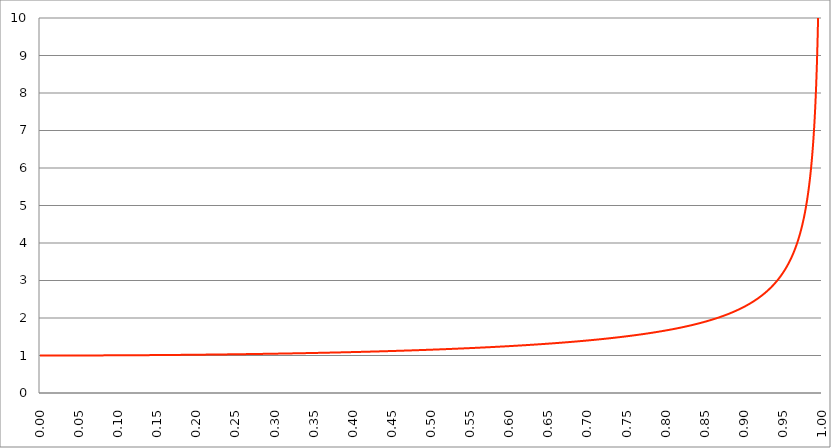
| Category | Series 1 |
|---|---|
| 0.0 | 1 |
| 0.0005 | 1 |
| 0.001 | 1 |
| 0.0015 | 1 |
| 0.002 | 1 |
| 0.0025 | 1 |
| 0.003 | 1 |
| 0.0035 | 1 |
| 0.004 | 1 |
| 0.0045 | 1 |
| 0.005 | 1 |
| 0.0055 | 1 |
| 0.006 | 1 |
| 0.0065 | 1 |
| 0.007 | 1 |
| 0.0075 | 1 |
| 0.008 | 1 |
| 0.0085 | 1 |
| 0.009 | 1 |
| 0.0095 | 1 |
| 0.01 | 1 |
| 0.0105 | 1 |
| 0.011 | 1 |
| 0.0115 | 1 |
| 0.012 | 1 |
| 0.0125 | 1 |
| 0.013 | 1 |
| 0.0135 | 1 |
| 0.014 | 1 |
| 0.0145 | 1 |
| 0.015 | 1 |
| 0.0155 | 1 |
| 0.016 | 1 |
| 0.0165 | 1 |
| 0.017 | 1 |
| 0.0175 | 1 |
| 0.018 | 1 |
| 0.0185 | 1 |
| 0.019 | 1 |
| 0.0195 | 1 |
| 0.02 | 1 |
| 0.0205 | 1 |
| 0.021 | 1 |
| 0.0215 | 1 |
| 0.022 | 1 |
| 0.0225 | 1 |
| 0.023 | 1 |
| 0.0235 | 1 |
| 0.024 | 1 |
| 0.0245 | 1 |
| 0.025 | 1 |
| 0.0255 | 1 |
| 0.026 | 1 |
| 0.0265 | 1 |
| 0.027 | 1 |
| 0.0275 | 1 |
| 0.028 | 1 |
| 0.0285 | 1 |
| 0.029 | 1 |
| 0.0295 | 1 |
| 0.03 | 1 |
| 0.0305 | 1 |
| 0.031 | 1 |
| 0.0315 | 1 |
| 0.032 | 1.001 |
| 0.0325 | 1.001 |
| 0.033 | 1.001 |
| 0.0335 | 1.001 |
| 0.034 | 1.001 |
| 0.0345 | 1.001 |
| 0.035 | 1.001 |
| 0.0355 | 1.001 |
| 0.036 | 1.001 |
| 0.0365 | 1.001 |
| 0.037 | 1.001 |
| 0.0375 | 1.001 |
| 0.038 | 1.001 |
| 0.0385 | 1.001 |
| 0.039 | 1.001 |
| 0.0395 | 1.001 |
| 0.04 | 1.001 |
| 0.0405 | 1.001 |
| 0.041 | 1.001 |
| 0.0415 | 1.001 |
| 0.042 | 1.001 |
| 0.0425 | 1.001 |
| 0.043 | 1.001 |
| 0.0435 | 1.001 |
| 0.044 | 1.001 |
| 0.0445 | 1.001 |
| 0.045 | 1.001 |
| 0.0455 | 1.001 |
| 0.046 | 1.001 |
| 0.0465 | 1.001 |
| 0.047 | 1.001 |
| 0.0475 | 1.001 |
| 0.048 | 1.001 |
| 0.0485 | 1.001 |
| 0.049 | 1.001 |
| 0.0495 | 1.001 |
| 0.05 | 1.001 |
| 0.0505 | 1.001 |
| 0.051 | 1.001 |
| 0.0515 | 1.001 |
| 0.052 | 1.001 |
| 0.0525 | 1.001 |
| 0.053 | 1.001 |
| 0.0535 | 1.001 |
| 0.054 | 1.001 |
| 0.0545 | 1.001 |
| 0.055 | 1.002 |
| 0.0555 | 1.002 |
| 0.056 | 1.002 |
| 0.0565 | 1.002 |
| 0.057 | 1.002 |
| 0.0575 | 1.002 |
| 0.058 | 1.002 |
| 0.0585 | 1.002 |
| 0.059 | 1.002 |
| 0.0595 | 1.002 |
| 0.06 | 1.002 |
| 0.0605 | 1.002 |
| 0.061 | 1.002 |
| 0.0615 | 1.002 |
| 0.062 | 1.002 |
| 0.0625 | 1.002 |
| 0.063 | 1.002 |
| 0.0635 | 1.002 |
| 0.064 | 1.002 |
| 0.0645 | 1.002 |
| 0.065 | 1.002 |
| 0.0655 | 1.002 |
| 0.066 | 1.002 |
| 0.0665 | 1.002 |
| 0.067 | 1.002 |
| 0.0675 | 1.002 |
| 0.068 | 1.002 |
| 0.0685 | 1.002 |
| 0.069 | 1.002 |
| 0.0695 | 1.002 |
| 0.07 | 1.002 |
| 0.0705 | 1.002 |
| 0.071 | 1.003 |
| 0.0715 | 1.003 |
| 0.072 | 1.003 |
| 0.0725 | 1.003 |
| 0.073 | 1.003 |
| 0.0735 | 1.003 |
| 0.074 | 1.003 |
| 0.0745 | 1.003 |
| 0.075 | 1.003 |
| 0.0755 | 1.003 |
| 0.076 | 1.003 |
| 0.0765 | 1.003 |
| 0.077 | 1.003 |
| 0.0775 | 1.003 |
| 0.078 | 1.003 |
| 0.0785 | 1.003 |
| 0.079 | 1.003 |
| 0.0795 | 1.003 |
| 0.08 | 1.003 |
| 0.0805 | 1.003 |
| 0.081 | 1.003 |
| 0.0815 | 1.003 |
| 0.082 | 1.003 |
| 0.0825 | 1.003 |
| 0.083 | 1.003 |
| 0.0835 | 1.004 |
| 0.084 | 1.004 |
| 0.0845 | 1.004 |
| 0.085 | 1.004 |
| 0.0855 | 1.004 |
| 0.086 | 1.004 |
| 0.0865 | 1.004 |
| 0.087 | 1.004 |
| 0.0875 | 1.004 |
| 0.088 | 1.004 |
| 0.0885 | 1.004 |
| 0.089 | 1.004 |
| 0.0895 | 1.004 |
| 0.09 | 1.004 |
| 0.0905 | 1.004 |
| 0.091 | 1.004 |
| 0.0915 | 1.004 |
| 0.092 | 1.004 |
| 0.0925 | 1.004 |
| 0.093 | 1.004 |
| 0.0935 | 1.004 |
| 0.094 | 1.004 |
| 0.0945 | 1.004 |
| 0.095 | 1.005 |
| 0.0955 | 1.005 |
| 0.096 | 1.005 |
| 0.0965 | 1.005 |
| 0.097 | 1.005 |
| 0.0975 | 1.005 |
| 0.098 | 1.005 |
| 0.0985 | 1.005 |
| 0.099 | 1.005 |
| 0.0995 | 1.005 |
| 0.1 | 1.005 |
| 0.1005 | 1.005 |
| 0.101 | 1.005 |
| 0.1015 | 1.005 |
| 0.102 | 1.005 |
| 0.1025 | 1.005 |
| 0.103 | 1.005 |
| 0.1035 | 1.005 |
| 0.104 | 1.005 |
| 0.1045 | 1.006 |
| 0.105 | 1.006 |
| 0.1055 | 1.006 |
| 0.106 | 1.006 |
| 0.1065 | 1.006 |
| 0.107 | 1.006 |
| 0.1075 | 1.006 |
| 0.108 | 1.006 |
| 0.1085 | 1.006 |
| 0.109 | 1.006 |
| 0.1095 | 1.006 |
| 0.11 | 1.006 |
| 0.1105 | 1.006 |
| 0.111 | 1.006 |
| 0.1115 | 1.006 |
| 0.112 | 1.006 |
| 0.1125 | 1.006 |
| 0.113 | 1.006 |
| 0.1135 | 1.007 |
| 0.114 | 1.007 |
| 0.1145 | 1.007 |
| 0.115 | 1.007 |
| 0.1155 | 1.007 |
| 0.116 | 1.007 |
| 0.1165 | 1.007 |
| 0.117 | 1.007 |
| 0.1175 | 1.007 |
| 0.118 | 1.007 |
| 0.1185 | 1.007 |
| 0.119 | 1.007 |
| 0.1195 | 1.007 |
| 0.12 | 1.007 |
| 0.1205 | 1.007 |
| 0.121 | 1.007 |
| 0.1215 | 1.007 |
| 0.122 | 1.008 |
| 0.1225 | 1.008 |
| 0.123 | 1.008 |
| 0.1235 | 1.008 |
| 0.124 | 1.008 |
| 0.1245 | 1.008 |
| 0.125 | 1.008 |
| 0.1255 | 1.008 |
| 0.126 | 1.008 |
| 0.1265 | 1.008 |
| 0.127 | 1.008 |
| 0.1275 | 1.008 |
| 0.128 | 1.008 |
| 0.1285 | 1.008 |
| 0.129 | 1.008 |
| 0.1295 | 1.008 |
| 0.13 | 1.009 |
| 0.1305 | 1.009 |
| 0.131 | 1.009 |
| 0.1315 | 1.009 |
| 0.132 | 1.009 |
| 0.1325 | 1.009 |
| 0.133 | 1.009 |
| 0.1335 | 1.009 |
| 0.134 | 1.009 |
| 0.1345 | 1.009 |
| 0.135 | 1.009 |
| 0.1355 | 1.009 |
| 0.136 | 1.009 |
| 0.1365 | 1.009 |
| 0.137 | 1.01 |
| 0.1375 | 1.01 |
| 0.138 | 1.01 |
| 0.1385 | 1.01 |
| 0.139 | 1.01 |
| 0.1395 | 1.01 |
| 0.14 | 1.01 |
| 0.1405 | 1.01 |
| 0.141 | 1.01 |
| 0.1415 | 1.01 |
| 0.142 | 1.01 |
| 0.1425 | 1.01 |
| 0.143 | 1.01 |
| 0.1435 | 1.01 |
| 0.144 | 1.011 |
| 0.1445 | 1.011 |
| 0.145 | 1.011 |
| 0.1455 | 1.011 |
| 0.146 | 1.011 |
| 0.1465 | 1.011 |
| 0.147 | 1.011 |
| 0.1475 | 1.011 |
| 0.148 | 1.011 |
| 0.1485 | 1.011 |
| 0.149 | 1.011 |
| 0.1495 | 1.011 |
| 0.15 | 1.011 |
| 0.1505 | 1.012 |
| 0.151 | 1.012 |
| 0.1515 | 1.012 |
| 0.152 | 1.012 |
| 0.1525 | 1.012 |
| 0.153 | 1.012 |
| 0.1535 | 1.012 |
| 0.154 | 1.012 |
| 0.1545 | 1.012 |
| 0.155 | 1.012 |
| 0.1555 | 1.012 |
| 0.156 | 1.012 |
| 0.1565 | 1.012 |
| 0.157 | 1.013 |
| 0.1575 | 1.013 |
| 0.158 | 1.013 |
| 0.1585 | 1.013 |
| 0.159 | 1.013 |
| 0.1595 | 1.013 |
| 0.16 | 1.013 |
| 0.1605 | 1.013 |
| 0.161 | 1.013 |
| 0.1615 | 1.013 |
| 0.162 | 1.013 |
| 0.1625 | 1.013 |
| 0.163 | 1.014 |
| 0.1635 | 1.014 |
| 0.164 | 1.014 |
| 0.1645 | 1.014 |
| 0.165 | 1.014 |
| 0.1655 | 1.014 |
| 0.166 | 1.014 |
| 0.1665 | 1.014 |
| 0.167 | 1.014 |
| 0.1675 | 1.014 |
| 0.168 | 1.014 |
| 0.1685 | 1.015 |
| 0.169 | 1.015 |
| 0.1695 | 1.015 |
| 0.17 | 1.015 |
| 0.1705 | 1.015 |
| 0.171 | 1.015 |
| 0.1715 | 1.015 |
| 0.172 | 1.015 |
| 0.1725 | 1.015 |
| 0.173 | 1.015 |
| 0.1735 | 1.015 |
| 0.174 | 1.015 |
| 0.1745 | 1.016 |
| 0.175 | 1.016 |
| 0.1755 | 1.016 |
| 0.176 | 1.016 |
| 0.1765 | 1.016 |
| 0.177 | 1.016 |
| 0.1775 | 1.016 |
| 0.178 | 1.016 |
| 0.1785 | 1.016 |
| 0.179 | 1.016 |
| 0.1795 | 1.017 |
| 0.18 | 1.017 |
| 0.1805 | 1.017 |
| 0.181 | 1.017 |
| 0.1815 | 1.017 |
| 0.182 | 1.017 |
| 0.1825 | 1.017 |
| 0.183 | 1.017 |
| 0.1835 | 1.017 |
| 0.184 | 1.017 |
| 0.1845 | 1.017 |
| 0.185 | 1.018 |
| 0.1855 | 1.018 |
| 0.186 | 1.018 |
| 0.1865 | 1.018 |
| 0.187 | 1.018 |
| 0.1875 | 1.018 |
| 0.188 | 1.018 |
| 0.1885 | 1.018 |
| 0.189 | 1.018 |
| 0.1895 | 1.018 |
| 0.19 | 1.019 |
| 0.1905 | 1.019 |
| 0.191 | 1.019 |
| 0.1915 | 1.019 |
| 0.192 | 1.019 |
| 0.1925 | 1.019 |
| 0.193 | 1.019 |
| 0.1935 | 1.019 |
| 0.194 | 1.019 |
| 0.1945 | 1.019 |
| 0.195 | 1.02 |
| 0.1955 | 1.02 |
| 0.196 | 1.02 |
| 0.1965 | 1.02 |
| 0.197 | 1.02 |
| 0.1975 | 1.02 |
| 0.198 | 1.02 |
| 0.1985 | 1.02 |
| 0.199 | 1.02 |
| 0.1995 | 1.021 |
| 0.2 | 1.021 |
| 0.2005 | 1.021 |
| 0.201 | 1.021 |
| 0.2015 | 1.021 |
| 0.202 | 1.021 |
| 0.2025 | 1.021 |
| 0.203 | 1.021 |
| 0.2035 | 1.021 |
| 0.204 | 1.021 |
| 0.2045 | 1.022 |
| 0.205 | 1.022 |
| 0.2055 | 1.022 |
| 0.206 | 1.022 |
| 0.2065 | 1.022 |
| 0.207 | 1.022 |
| 0.2075 | 1.022 |
| 0.208 | 1.022 |
| 0.2085 | 1.022 |
| 0.209 | 1.023 |
| 0.2095 | 1.023 |
| 0.21 | 1.023 |
| 0.2105 | 1.023 |
| 0.211 | 1.023 |
| 0.2115 | 1.023 |
| 0.212 | 1.023 |
| 0.2125 | 1.023 |
| 0.213 | 1.023 |
| 0.2135 | 1.024 |
| 0.214 | 1.024 |
| 0.2145 | 1.024 |
| 0.215 | 1.024 |
| 0.2155 | 1.024 |
| 0.216 | 1.024 |
| 0.2165 | 1.024 |
| 0.217 | 1.024 |
| 0.2175 | 1.025 |
| 0.218 | 1.025 |
| 0.2185 | 1.025 |
| 0.219 | 1.025 |
| 0.2195 | 1.025 |
| 0.22 | 1.025 |
| 0.2205 | 1.025 |
| 0.221 | 1.025 |
| 0.2215 | 1.025 |
| 0.222 | 1.026 |
| 0.2225 | 1.026 |
| 0.223 | 1.026 |
| 0.2235 | 1.026 |
| 0.224 | 1.026 |
| 0.2245 | 1.026 |
| 0.225 | 1.026 |
| 0.2255 | 1.026 |
| 0.226 | 1.027 |
| 0.2265 | 1.027 |
| 0.227 | 1.027 |
| 0.2275 | 1.027 |
| 0.228 | 1.027 |
| 0.2285 | 1.027 |
| 0.229 | 1.027 |
| 0.2295 | 1.027 |
| 0.23 | 1.028 |
| 0.2305 | 1.028 |
| 0.231 | 1.028 |
| 0.2315 | 1.028 |
| 0.232 | 1.028 |
| 0.2325 | 1.028 |
| 0.233 | 1.028 |
| 0.2335 | 1.028 |
| 0.234 | 1.029 |
| 0.2345 | 1.029 |
| 0.235 | 1.029 |
| 0.2355 | 1.029 |
| 0.236 | 1.029 |
| 0.2365 | 1.029 |
| 0.237 | 1.029 |
| 0.2375 | 1.029 |
| 0.238 | 1.03 |
| 0.2385 | 1.03 |
| 0.239 | 1.03 |
| 0.2395 | 1.03 |
| 0.24 | 1.03 |
| 0.2405 | 1.03 |
| 0.241 | 1.03 |
| 0.2415 | 1.031 |
| 0.242 | 1.031 |
| 0.2425 | 1.031 |
| 0.243 | 1.031 |
| 0.2435 | 1.031 |
| 0.244 | 1.031 |
| 0.2445 | 1.031 |
| 0.245 | 1.031 |
| 0.2455 | 1.032 |
| 0.246 | 1.032 |
| 0.2465 | 1.032 |
| 0.247 | 1.032 |
| 0.2475 | 1.032 |
| 0.248 | 1.032 |
| 0.2485 | 1.032 |
| 0.249 | 1.033 |
| 0.2495 | 1.033 |
| 0.25 | 1.033 |
| 0.2505 | 1.033 |
| 0.251 | 1.033 |
| 0.2515 | 1.033 |
| 0.252 | 1.033 |
| 0.2525 | 1.033 |
| 0.253 | 1.034 |
| 0.2535 | 1.034 |
| 0.254 | 1.034 |
| 0.2545 | 1.034 |
| 0.255 | 1.034 |
| 0.2555 | 1.034 |
| 0.256 | 1.034 |
| 0.2565 | 1.035 |
| 0.257 | 1.035 |
| 0.2575 | 1.035 |
| 0.258 | 1.035 |
| 0.2585 | 1.035 |
| 0.259 | 1.035 |
| 0.2595 | 1.035 |
| 0.26 | 1.036 |
| 0.2605 | 1.036 |
| 0.261 | 1.036 |
| 0.2615 | 1.036 |
| 0.262 | 1.036 |
| 0.2625 | 1.036 |
| 0.263 | 1.036 |
| 0.2635 | 1.037 |
| 0.264 | 1.037 |
| 0.2645 | 1.037 |
| 0.265 | 1.037 |
| 0.2655 | 1.037 |
| 0.266 | 1.037 |
| 0.2665 | 1.038 |
| 0.267 | 1.038 |
| 0.2675 | 1.038 |
| 0.268 | 1.038 |
| 0.2685 | 1.038 |
| 0.269 | 1.038 |
| 0.2695 | 1.038 |
| 0.27 | 1.039 |
| 0.2705 | 1.039 |
| 0.271 | 1.039 |
| 0.2715 | 1.039 |
| 0.272 | 1.039 |
| 0.2725 | 1.039 |
| 0.273 | 1.039 |
| 0.2735 | 1.04 |
| 0.274 | 1.04 |
| 0.2745 | 1.04 |
| 0.275 | 1.04 |
| 0.2755 | 1.04 |
| 0.276 | 1.04 |
| 0.2765 | 1.041 |
| 0.277 | 1.041 |
| 0.2775 | 1.041 |
| 0.278 | 1.041 |
| 0.2785 | 1.041 |
| 0.279 | 1.041 |
| 0.2795 | 1.042 |
| 0.28 | 1.042 |
| 0.2805 | 1.042 |
| 0.281 | 1.042 |
| 0.2815 | 1.042 |
| 0.282 | 1.042 |
| 0.2825 | 1.042 |
| 0.283 | 1.043 |
| 0.2835 | 1.043 |
| 0.284 | 1.043 |
| 0.2845 | 1.043 |
| 0.285 | 1.043 |
| 0.2855 | 1.043 |
| 0.286 | 1.044 |
| 0.2865 | 1.044 |
| 0.287 | 1.044 |
| 0.2875 | 1.044 |
| 0.288 | 1.044 |
| 0.2885 | 1.044 |
| 0.289 | 1.045 |
| 0.2895 | 1.045 |
| 0.29 | 1.045 |
| 0.2905 | 1.045 |
| 0.291 | 1.045 |
| 0.2915 | 1.045 |
| 0.292 | 1.046 |
| 0.2925 | 1.046 |
| 0.293 | 1.046 |
| 0.2935 | 1.046 |
| 0.294 | 1.046 |
| 0.2945 | 1.046 |
| 0.295 | 1.047 |
| 0.2955 | 1.047 |
| 0.296 | 1.047 |
| 0.2965 | 1.047 |
| 0.297 | 1.047 |
| 0.2975 | 1.047 |
| 0.298 | 1.048 |
| 0.2985 | 1.048 |
| 0.299 | 1.048 |
| 0.2995 | 1.048 |
| 0.3 | 1.048 |
| 0.3005 | 1.048 |
| 0.301 | 1.049 |
| 0.3015 | 1.049 |
| 0.302 | 1.049 |
| 0.3025 | 1.049 |
| 0.303 | 1.049 |
| 0.3035 | 1.05 |
| 0.304 | 1.05 |
| 0.3045 | 1.05 |
| 0.305 | 1.05 |
| 0.3055 | 1.05 |
| 0.306 | 1.05 |
| 0.3065 | 1.051 |
| 0.307 | 1.051 |
| 0.3075 | 1.051 |
| 0.308 | 1.051 |
| 0.3085 | 1.051 |
| 0.309 | 1.051 |
| 0.3095 | 1.052 |
| 0.31 | 1.052 |
| 0.3105 | 1.052 |
| 0.311 | 1.052 |
| 0.3115 | 1.052 |
| 0.312 | 1.053 |
| 0.3125 | 1.053 |
| 0.313 | 1.053 |
| 0.3135 | 1.053 |
| 0.314 | 1.053 |
| 0.3145 | 1.053 |
| 0.315 | 1.054 |
| 0.3155 | 1.054 |
| 0.316 | 1.054 |
| 0.3165 | 1.054 |
| 0.317 | 1.054 |
| 0.3175 | 1.055 |
| 0.318 | 1.055 |
| 0.3185 | 1.055 |
| 0.319 | 1.055 |
| 0.3195 | 1.055 |
| 0.32 | 1.056 |
| 0.3205 | 1.056 |
| 0.321 | 1.056 |
| 0.3215 | 1.056 |
| 0.322 | 1.056 |
| 0.3225 | 1.056 |
| 0.323 | 1.057 |
| 0.3235 | 1.057 |
| 0.324 | 1.057 |
| 0.3245 | 1.057 |
| 0.325 | 1.057 |
| 0.3255 | 1.058 |
| 0.326 | 1.058 |
| 0.3265 | 1.058 |
| 0.327 | 1.058 |
| 0.3275 | 1.058 |
| 0.328 | 1.059 |
| 0.3285 | 1.059 |
| 0.329 | 1.059 |
| 0.3295 | 1.059 |
| 0.33 | 1.059 |
| 0.3305 | 1.06 |
| 0.331 | 1.06 |
| 0.3315 | 1.06 |
| 0.332 | 1.06 |
| 0.3325 | 1.06 |
| 0.333 | 1.061 |
| 0.3335 | 1.061 |
| 0.334 | 1.061 |
| 0.3345 | 1.061 |
| 0.335 | 1.061 |
| 0.3355 | 1.062 |
| 0.336 | 1.062 |
| 0.3365 | 1.062 |
| 0.337 | 1.062 |
| 0.3375 | 1.062 |
| 0.338 | 1.063 |
| 0.3385 | 1.063 |
| 0.339 | 1.063 |
| 0.3395 | 1.063 |
| 0.34 | 1.063 |
| 0.3405 | 1.064 |
| 0.341 | 1.064 |
| 0.3415 | 1.064 |
| 0.342 | 1.064 |
| 0.3425 | 1.064 |
| 0.343 | 1.065 |
| 0.3435 | 1.065 |
| 0.344 | 1.065 |
| 0.3445 | 1.065 |
| 0.345 | 1.065 |
| 0.3455 | 1.066 |
| 0.346 | 1.066 |
| 0.3465 | 1.066 |
| 0.347 | 1.066 |
| 0.3475 | 1.066 |
| 0.348 | 1.067 |
| 0.3485 | 1.067 |
| 0.349 | 1.067 |
| 0.3495 | 1.067 |
| 0.35 | 1.068 |
| 0.3505 | 1.068 |
| 0.351 | 1.068 |
| 0.3515 | 1.068 |
| 0.352 | 1.068 |
| 0.3525 | 1.069 |
| 0.353 | 1.069 |
| 0.3535 | 1.069 |
| 0.354 | 1.069 |
| 0.3545 | 1.069 |
| 0.355 | 1.07 |
| 0.3555 | 1.07 |
| 0.356 | 1.07 |
| 0.3565 | 1.07 |
| 0.357 | 1.071 |
| 0.3575 | 1.071 |
| 0.358 | 1.071 |
| 0.3585 | 1.071 |
| 0.359 | 1.071 |
| 0.3595 | 1.072 |
| 0.36 | 1.072 |
| 0.3605 | 1.072 |
| 0.361 | 1.072 |
| 0.3615 | 1.073 |
| 0.362 | 1.073 |
| 0.3625 | 1.073 |
| 0.363 | 1.073 |
| 0.3635 | 1.073 |
| 0.364 | 1.074 |
| 0.3645 | 1.074 |
| 0.365 | 1.074 |
| 0.3655 | 1.074 |
| 0.366 | 1.075 |
| 0.3665 | 1.075 |
| 0.367 | 1.075 |
| 0.3675 | 1.075 |
| 0.368 | 1.075 |
| 0.3685 | 1.076 |
| 0.369 | 1.076 |
| 0.3695 | 1.076 |
| 0.37 | 1.076 |
| 0.3705 | 1.077 |
| 0.371 | 1.077 |
| 0.3715 | 1.077 |
| 0.372 | 1.077 |
| 0.3725 | 1.078 |
| 0.373 | 1.078 |
| 0.3735 | 1.078 |
| 0.374 | 1.078 |
| 0.3745 | 1.078 |
| 0.375 | 1.079 |
| 0.3755 | 1.079 |
| 0.376 | 1.079 |
| 0.3765 | 1.079 |
| 0.377 | 1.08 |
| 0.3775 | 1.08 |
| 0.378 | 1.08 |
| 0.3785 | 1.08 |
| 0.379 | 1.081 |
| 0.3795 | 1.081 |
| 0.38 | 1.081 |
| 0.3805 | 1.081 |
| 0.381 | 1.082 |
| 0.3815 | 1.082 |
| 0.382 | 1.082 |
| 0.3825 | 1.082 |
| 0.383 | 1.083 |
| 0.3835 | 1.083 |
| 0.384 | 1.083 |
| 0.3845 | 1.083 |
| 0.385 | 1.084 |
| 0.3855 | 1.084 |
| 0.386 | 1.084 |
| 0.3865 | 1.084 |
| 0.387 | 1.085 |
| 0.3875 | 1.085 |
| 0.388 | 1.085 |
| 0.3885 | 1.085 |
| 0.389 | 1.085 |
| 0.3895 | 1.086 |
| 0.39 | 1.086 |
| 0.3905 | 1.086 |
| 0.391 | 1.086 |
| 0.3915 | 1.087 |
| 0.392 | 1.087 |
| 0.3925 | 1.087 |
| 0.393 | 1.088 |
| 0.3935 | 1.088 |
| 0.394 | 1.088 |
| 0.3945 | 1.088 |
| 0.395 | 1.089 |
| 0.3955 | 1.089 |
| 0.396 | 1.089 |
| 0.3965 | 1.089 |
| 0.397 | 1.09 |
| 0.3975 | 1.09 |
| 0.398 | 1.09 |
| 0.3985 | 1.09 |
| 0.399 | 1.091 |
| 0.3995 | 1.091 |
| 0.4 | 1.091 |
| 0.4005 | 1.091 |
| 0.401 | 1.092 |
| 0.4015 | 1.092 |
| 0.402 | 1.092 |
| 0.4025 | 1.092 |
| 0.403 | 1.093 |
| 0.4035 | 1.093 |
| 0.404 | 1.093 |
| 0.4045 | 1.093 |
| 0.405 | 1.094 |
| 0.4055 | 1.094 |
| 0.406 | 1.094 |
| 0.4065 | 1.095 |
| 0.407 | 1.095 |
| 0.4075 | 1.095 |
| 0.408 | 1.095 |
| 0.4085 | 1.096 |
| 0.409 | 1.096 |
| 0.4095 | 1.096 |
| 0.41 | 1.096 |
| 0.4105 | 1.097 |
| 0.411 | 1.097 |
| 0.4115 | 1.097 |
| 0.412 | 1.097 |
| 0.4125 | 1.098 |
| 0.413 | 1.098 |
| 0.4135 | 1.098 |
| 0.414 | 1.099 |
| 0.4145 | 1.099 |
| 0.415 | 1.099 |
| 0.4155 | 1.099 |
| 0.416 | 1.1 |
| 0.4165 | 1.1 |
| 0.417 | 1.1 |
| 0.4175 | 1.101 |
| 0.418 | 1.101 |
| 0.4185 | 1.101 |
| 0.419 | 1.101 |
| 0.4195 | 1.102 |
| 0.42 | 1.102 |
| 0.4205 | 1.102 |
| 0.421 | 1.102 |
| 0.4215 | 1.103 |
| 0.422 | 1.103 |
| 0.4225 | 1.103 |
| 0.423 | 1.104 |
| 0.4235 | 1.104 |
| 0.424 | 1.104 |
| 0.4245 | 1.104 |
| 0.425 | 1.105 |
| 0.4255 | 1.105 |
| 0.426 | 1.105 |
| 0.4265 | 1.106 |
| 0.427 | 1.106 |
| 0.4275 | 1.106 |
| 0.428 | 1.106 |
| 0.4285 | 1.107 |
| 0.429 | 1.107 |
| 0.4295 | 1.107 |
| 0.43 | 1.108 |
| 0.4305 | 1.108 |
| 0.431 | 1.108 |
| 0.4315 | 1.109 |
| 0.432 | 1.109 |
| 0.4325 | 1.109 |
| 0.433 | 1.109 |
| 0.4335 | 1.11 |
| 0.434 | 1.11 |
| 0.4345 | 1.11 |
| 0.435 | 1.111 |
| 0.4355 | 1.111 |
| 0.436 | 1.111 |
| 0.4365 | 1.111 |
| 0.437 | 1.112 |
| 0.4375 | 1.112 |
| 0.438 | 1.112 |
| 0.4385 | 1.113 |
| 0.439 | 1.113 |
| 0.4395 | 1.113 |
| 0.44 | 1.114 |
| 0.4405 | 1.114 |
| 0.441 | 1.114 |
| 0.4415 | 1.115 |
| 0.442 | 1.115 |
| 0.4425 | 1.115 |
| 0.443 | 1.115 |
| 0.4435 | 1.116 |
| 0.444 | 1.116 |
| 0.4445 | 1.116 |
| 0.445 | 1.117 |
| 0.4455 | 1.117 |
| 0.446 | 1.117 |
| 0.4465 | 1.118 |
| 0.447 | 1.118 |
| 0.4475 | 1.118 |
| 0.448 | 1.119 |
| 0.4485 | 1.119 |
| 0.449 | 1.119 |
| 0.4495 | 1.119 |
| 0.45 | 1.12 |
| 0.4505 | 1.12 |
| 0.451 | 1.12 |
| 0.4515 | 1.121 |
| 0.452 | 1.121 |
| 0.4525 | 1.121 |
| 0.453 | 1.122 |
| 0.4535 | 1.122 |
| 0.454 | 1.122 |
| 0.4545 | 1.123 |
| 0.455 | 1.123 |
| 0.4555 | 1.123 |
| 0.456 | 1.124 |
| 0.4565 | 1.124 |
| 0.457 | 1.124 |
| 0.4575 | 1.125 |
| 0.458 | 1.125 |
| 0.4585 | 1.125 |
| 0.459 | 1.126 |
| 0.4595 | 1.126 |
| 0.46 | 1.126 |
| 0.4605 | 1.127 |
| 0.461 | 1.127 |
| 0.4615 | 1.127 |
| 0.462 | 1.128 |
| 0.4625 | 1.128 |
| 0.463 | 1.128 |
| 0.4635 | 1.129 |
| 0.464 | 1.129 |
| 0.4645 | 1.129 |
| 0.465 | 1.13 |
| 0.4655 | 1.13 |
| 0.466 | 1.13 |
| 0.4665 | 1.131 |
| 0.467 | 1.131 |
| 0.4675 | 1.131 |
| 0.468 | 1.132 |
| 0.4685 | 1.132 |
| 0.469 | 1.132 |
| 0.4695 | 1.133 |
| 0.47 | 1.133 |
| 0.4705 | 1.133 |
| 0.471 | 1.134 |
| 0.4715 | 1.134 |
| 0.472 | 1.134 |
| 0.4725 | 1.135 |
| 0.473 | 1.135 |
| 0.4735 | 1.135 |
| 0.474 | 1.136 |
| 0.4745 | 1.136 |
| 0.475 | 1.136 |
| 0.4755 | 1.137 |
| 0.476 | 1.137 |
| 0.4765 | 1.137 |
| 0.477 | 1.138 |
| 0.4775 | 1.138 |
| 0.478 | 1.138 |
| 0.4785 | 1.139 |
| 0.479 | 1.139 |
| 0.4795 | 1.14 |
| 0.48 | 1.14 |
| 0.4805 | 1.14 |
| 0.481 | 1.141 |
| 0.4815 | 1.141 |
| 0.482 | 1.141 |
| 0.4825 | 1.142 |
| 0.483 | 1.142 |
| 0.4835 | 1.142 |
| 0.484 | 1.143 |
| 0.4845 | 1.143 |
| 0.485 | 1.143 |
| 0.4855 | 1.144 |
| 0.486 | 1.144 |
| 0.4865 | 1.145 |
| 0.487 | 1.145 |
| 0.4875 | 1.145 |
| 0.488 | 1.146 |
| 0.4885 | 1.146 |
| 0.489 | 1.146 |
| 0.4895 | 1.147 |
| 0.49 | 1.147 |
| 0.4905 | 1.148 |
| 0.491 | 1.148 |
| 0.4915 | 1.148 |
| 0.492 | 1.149 |
| 0.4925 | 1.149 |
| 0.493 | 1.149 |
| 0.4935 | 1.15 |
| 0.494 | 1.15 |
| 0.4945 | 1.151 |
| 0.495 | 1.151 |
| 0.4955 | 1.151 |
| 0.496 | 1.152 |
| 0.4965 | 1.152 |
| 0.497 | 1.152 |
| 0.4975 | 1.153 |
| 0.498 | 1.153 |
| 0.4985 | 1.154 |
| 0.499 | 1.154 |
| 0.4995 | 1.154 |
| 0.5 | 1.155 |
| 0.5005 | 1.155 |
| 0.501 | 1.155 |
| 0.5015 | 1.156 |
| 0.502 | 1.156 |
| 0.5025 | 1.157 |
| 0.503 | 1.157 |
| 0.5035 | 1.157 |
| 0.504 | 1.158 |
| 0.5045 | 1.158 |
| 0.505 | 1.159 |
| 0.5055 | 1.159 |
| 0.506 | 1.159 |
| 0.5065 | 1.16 |
| 0.507 | 1.16 |
| 0.5075 | 1.161 |
| 0.507999999999999 | 1.161 |
| 0.508499999999999 | 1.161 |
| 0.508999999999999 | 1.162 |
| 0.509499999999999 | 1.162 |
| 0.509999999999999 | 1.163 |
| 0.510499999999999 | 1.163 |
| 0.510999999999999 | 1.163 |
| 0.511499999999999 | 1.164 |
| 0.511999999999999 | 1.164 |
| 0.512499999999999 | 1.165 |
| 0.512999999999999 | 1.165 |
| 0.513499999999999 | 1.165 |
| 0.513999999999999 | 1.166 |
| 0.514499999999999 | 1.166 |
| 0.514999999999999 | 1.167 |
| 0.515499999999999 | 1.167 |
| 0.515999999999999 | 1.167 |
| 0.516499999999999 | 1.168 |
| 0.516999999999998 | 1.168 |
| 0.517499999999998 | 1.169 |
| 0.517999999999998 | 1.169 |
| 0.518499999999998 | 1.169 |
| 0.518999999999998 | 1.17 |
| 0.519499999999998 | 1.17 |
| 0.519999999999998 | 1.171 |
| 0.520499999999998 | 1.171 |
| 0.520999999999998 | 1.172 |
| 0.521499999999998 | 1.172 |
| 0.521999999999998 | 1.172 |
| 0.522499999999998 | 1.173 |
| 0.522999999999998 | 1.173 |
| 0.523499999999998 | 1.174 |
| 0.523999999999998 | 1.174 |
| 0.524499999999998 | 1.175 |
| 0.524999999999998 | 1.175 |
| 0.525499999999998 | 1.175 |
| 0.525999999999997 | 1.176 |
| 0.526499999999997 | 1.176 |
| 0.526999999999997 | 1.177 |
| 0.527499999999997 | 1.177 |
| 0.527999999999997 | 1.178 |
| 0.528499999999997 | 1.178 |
| 0.528999999999997 | 1.178 |
| 0.529499999999997 | 1.179 |
| 0.529999999999997 | 1.179 |
| 0.530499999999997 | 1.18 |
| 0.530999999999997 | 1.18 |
| 0.531499999999997 | 1.181 |
| 0.531999999999997 | 1.181 |
| 0.532499999999997 | 1.181 |
| 0.532999999999997 | 1.182 |
| 0.533499999999997 | 1.182 |
| 0.533999999999997 | 1.183 |
| 0.534499999999997 | 1.183 |
| 0.534999999999996 | 1.184 |
| 0.535499999999996 | 1.184 |
| 0.535999999999996 | 1.185 |
| 0.536499999999996 | 1.185 |
| 0.536999999999996 | 1.185 |
| 0.537499999999996 | 1.186 |
| 0.537999999999996 | 1.186 |
| 0.538499999999996 | 1.187 |
| 0.538999999999996 | 1.187 |
| 0.539499999999996 | 1.188 |
| 0.539999999999996 | 1.188 |
| 0.540499999999996 | 1.189 |
| 0.540999999999996 | 1.189 |
| 0.541499999999996 | 1.189 |
| 0.541999999999996 | 1.19 |
| 0.542499999999996 | 1.19 |
| 0.542999999999996 | 1.191 |
| 0.543499999999996 | 1.191 |
| 0.543999999999995 | 1.192 |
| 0.544499999999995 | 1.192 |
| 0.544999999999995 | 1.193 |
| 0.545499999999995 | 1.193 |
| 0.545999999999995 | 1.194 |
| 0.546499999999995 | 1.194 |
| 0.546999999999995 | 1.195 |
| 0.547499999999995 | 1.195 |
| 0.547999999999995 | 1.195 |
| 0.548499999999995 | 1.196 |
| 0.548999999999995 | 1.196 |
| 0.549499999999995 | 1.197 |
| 0.549999999999995 | 1.197 |
| 0.550499999999995 | 1.198 |
| 0.550999999999995 | 1.198 |
| 0.551499999999995 | 1.199 |
| 0.551999999999995 | 1.199 |
| 0.552499999999995 | 1.2 |
| 0.552999999999994 | 1.2 |
| 0.553499999999994 | 1.201 |
| 0.553999999999994 | 1.201 |
| 0.554499999999994 | 1.202 |
| 0.554999999999994 | 1.202 |
| 0.555499999999994 | 1.203 |
| 0.555999999999994 | 1.203 |
| 0.556499999999994 | 1.204 |
| 0.556999999999994 | 1.204 |
| 0.557499999999994 | 1.205 |
| 0.557999999999994 | 1.205 |
| 0.558499999999994 | 1.206 |
| 0.558999999999994 | 1.206 |
| 0.559499999999994 | 1.207 |
| 0.559999999999994 | 1.207 |
| 0.560499999999994 | 1.208 |
| 0.560999999999994 | 1.208 |
| 0.561499999999994 | 1.208 |
| 0.561999999999993 | 1.209 |
| 0.562499999999993 | 1.209 |
| 0.562999999999993 | 1.21 |
| 0.563499999999993 | 1.21 |
| 0.563999999999993 | 1.211 |
| 0.564499999999993 | 1.211 |
| 0.564999999999993 | 1.212 |
| 0.565499999999993 | 1.212 |
| 0.565999999999993 | 1.213 |
| 0.566499999999993 | 1.214 |
| 0.566999999999993 | 1.214 |
| 0.567499999999993 | 1.215 |
| 0.567999999999993 | 1.215 |
| 0.568499999999993 | 1.216 |
| 0.568999999999993 | 1.216 |
| 0.569499999999993 | 1.217 |
| 0.569999999999993 | 1.217 |
| 0.570499999999993 | 1.218 |
| 0.570999999999993 | 1.218 |
| 0.571499999999992 | 1.219 |
| 0.571999999999992 | 1.219 |
| 0.572499999999992 | 1.22 |
| 0.572999999999992 | 1.22 |
| 0.573499999999992 | 1.221 |
| 0.573999999999992 | 1.221 |
| 0.574499999999992 | 1.222 |
| 0.574999999999992 | 1.222 |
| 0.575499999999992 | 1.223 |
| 0.575999999999992 | 1.223 |
| 0.576499999999992 | 1.224 |
| 0.576999999999992 | 1.224 |
| 0.577499999999992 | 1.225 |
| 0.577999999999992 | 1.225 |
| 0.578499999999992 | 1.226 |
| 0.578999999999992 | 1.227 |
| 0.579499999999992 | 1.227 |
| 0.579999999999992 | 1.228 |
| 0.580499999999991 | 1.228 |
| 0.580999999999991 | 1.229 |
| 0.581499999999991 | 1.229 |
| 0.581999999999991 | 1.23 |
| 0.582499999999991 | 1.23 |
| 0.582999999999991 | 1.231 |
| 0.583499999999991 | 1.231 |
| 0.583999999999991 | 1.232 |
| 0.584499999999991 | 1.232 |
| 0.584999999999991 | 1.233 |
| 0.585499999999991 | 1.234 |
| 0.585999999999991 | 1.234 |
| 0.586499999999991 | 1.235 |
| 0.586999999999991 | 1.235 |
| 0.587499999999991 | 1.236 |
| 0.587999999999991 | 1.236 |
| 0.588499999999991 | 1.237 |
| 0.588999999999991 | 1.237 |
| 0.58949999999999 | 1.238 |
| 0.58999999999999 | 1.239 |
| 0.59049999999999 | 1.239 |
| 0.59099999999999 | 1.24 |
| 0.59149999999999 | 1.24 |
| 0.59199999999999 | 1.241 |
| 0.59249999999999 | 1.241 |
| 0.59299999999999 | 1.242 |
| 0.59349999999999 | 1.242 |
| 0.59399999999999 | 1.243 |
| 0.59449999999999 | 1.244 |
| 0.59499999999999 | 1.244 |
| 0.59549999999999 | 1.245 |
| 0.59599999999999 | 1.245 |
| 0.59649999999999 | 1.246 |
| 0.59699999999999 | 1.247 |
| 0.59749999999999 | 1.247 |
| 0.59799999999999 | 1.248 |
| 0.598499999999989 | 1.248 |
| 0.598999999999989 | 1.249 |
| 0.599499999999989 | 1.249 |
| 0.599999999999989 | 1.25 |
| 0.600499999999989 | 1.251 |
| 0.600999999999989 | 1.251 |
| 0.601499999999989 | 1.252 |
| 0.601999999999989 | 1.252 |
| 0.602499999999989 | 1.253 |
| 0.602999999999989 | 1.254 |
| 0.603499999999989 | 1.254 |
| 0.603999999999989 | 1.255 |
| 0.604499999999989 | 1.255 |
| 0.604999999999989 | 1.256 |
| 0.605499999999989 | 1.257 |
| 0.605999999999989 | 1.257 |
| 0.606499999999989 | 1.258 |
| 0.606999999999988 | 1.258 |
| 0.607499999999988 | 1.259 |
| 0.607999999999988 | 1.26 |
| 0.608499999999988 | 1.26 |
| 0.608999999999988 | 1.261 |
| 0.609499999999988 | 1.261 |
| 0.609999999999988 | 1.262 |
| 0.610499999999988 | 1.263 |
| 0.610999999999988 | 1.263 |
| 0.611499999999988 | 1.264 |
| 0.611999999999988 | 1.264 |
| 0.612499999999988 | 1.265 |
| 0.612999999999988 | 1.266 |
| 0.613499999999988 | 1.266 |
| 0.613999999999988 | 1.267 |
| 0.614499999999988 | 1.268 |
| 0.614999999999988 | 1.268 |
| 0.615499999999988 | 1.269 |
| 0.615999999999987 | 1.269 |
| 0.616499999999987 | 1.27 |
| 0.616999999999987 | 1.271 |
| 0.617499999999987 | 1.271 |
| 0.617999999999987 | 1.272 |
| 0.618499999999987 | 1.273 |
| 0.618999999999987 | 1.273 |
| 0.619499999999987 | 1.274 |
| 0.619999999999987 | 1.275 |
| 0.620499999999987 | 1.275 |
| 0.620999999999987 | 1.276 |
| 0.621499999999987 | 1.276 |
| 0.621999999999987 | 1.277 |
| 0.622499999999987 | 1.278 |
| 0.622999999999987 | 1.278 |
| 0.623499999999987 | 1.279 |
| 0.623999999999987 | 1.28 |
| 0.624499999999987 | 1.28 |
| 0.624999999999986 | 1.281 |
| 0.625499999999986 | 1.282 |
| 0.625999999999986 | 1.282 |
| 0.626499999999986 | 1.283 |
| 0.626999999999986 | 1.284 |
| 0.627499999999986 | 1.284 |
| 0.627999999999986 | 1.285 |
| 0.628499999999986 | 1.286 |
| 0.628999999999986 | 1.286 |
| 0.629499999999986 | 1.287 |
| 0.629999999999986 | 1.288 |
| 0.630499999999986 | 1.288 |
| 0.630999999999986 | 1.289 |
| 0.631499999999986 | 1.29 |
| 0.631999999999986 | 1.29 |
| 0.632499999999986 | 1.291 |
| 0.632999999999986 | 1.292 |
| 0.633499999999986 | 1.292 |
| 0.633999999999985 | 1.293 |
| 0.634499999999985 | 1.294 |
| 0.634999999999985 | 1.294 |
| 0.635499999999985 | 1.295 |
| 0.635999999999985 | 1.296 |
| 0.636499999999985 | 1.297 |
| 0.636999999999985 | 1.297 |
| 0.637499999999985 | 1.298 |
| 0.637999999999985 | 1.299 |
| 0.638499999999985 | 1.299 |
| 0.638999999999985 | 1.3 |
| 0.639499999999985 | 1.301 |
| 0.639999999999985 | 1.301 |
| 0.640499999999985 | 1.302 |
| 0.640999999999985 | 1.303 |
| 0.641499999999985 | 1.304 |
| 0.641999999999985 | 1.304 |
| 0.642499999999985 | 1.305 |
| 0.642999999999984 | 1.306 |
| 0.643499999999984 | 1.306 |
| 0.643999999999984 | 1.307 |
| 0.644499999999984 | 1.308 |
| 0.644999999999984 | 1.309 |
| 0.645499999999984 | 1.309 |
| 0.645999999999984 | 1.31 |
| 0.646499999999984 | 1.311 |
| 0.646999999999984 | 1.311 |
| 0.647499999999984 | 1.312 |
| 0.647999999999984 | 1.313 |
| 0.648499999999984 | 1.314 |
| 0.648999999999984 | 1.314 |
| 0.649499999999984 | 1.315 |
| 0.649999999999984 | 1.316 |
| 0.650499999999984 | 1.317 |
| 0.650999999999984 | 1.317 |
| 0.651499999999984 | 1.318 |
| 0.651999999999983 | 1.319 |
| 0.652499999999983 | 1.32 |
| 0.652999999999983 | 1.32 |
| 0.653499999999983 | 1.321 |
| 0.653999999999983 | 1.322 |
| 0.654499999999983 | 1.323 |
| 0.654999999999983 | 1.323 |
| 0.655499999999983 | 1.324 |
| 0.655999999999983 | 1.325 |
| 0.656499999999983 | 1.326 |
| 0.656999999999983 | 1.326 |
| 0.657499999999983 | 1.327 |
| 0.657999999999983 | 1.328 |
| 0.658499999999983 | 1.329 |
| 0.658999999999983 | 1.33 |
| 0.659499999999983 | 1.33 |
| 0.659999999999983 | 1.331 |
| 0.660499999999983 | 1.332 |
| 0.660999999999983 | 1.333 |
| 0.661499999999982 | 1.333 |
| 0.661999999999982 | 1.334 |
| 0.662499999999982 | 1.335 |
| 0.662999999999982 | 1.336 |
| 0.663499999999982 | 1.337 |
| 0.663999999999982 | 1.337 |
| 0.664499999999982 | 1.338 |
| 0.664999999999982 | 1.339 |
| 0.665499999999982 | 1.34 |
| 0.665999999999982 | 1.341 |
| 0.666499999999982 | 1.341 |
| 0.666999999999982 | 1.342 |
| 0.667499999999982 | 1.343 |
| 0.667999999999982 | 1.344 |
| 0.668499999999982 | 1.345 |
| 0.668999999999982 | 1.345 |
| 0.669499999999982 | 1.346 |
| 0.669999999999982 | 1.347 |
| 0.670499999999981 | 1.348 |
| 0.670999999999981 | 1.349 |
| 0.671499999999981 | 1.35 |
| 0.671999999999981 | 1.35 |
| 0.672499999999981 | 1.351 |
| 0.672999999999981 | 1.352 |
| 0.673499999999981 | 1.353 |
| 0.673999999999981 | 1.354 |
| 0.674499999999981 | 1.355 |
| 0.674999999999981 | 1.355 |
| 0.675499999999981 | 1.356 |
| 0.675999999999981 | 1.357 |
| 0.676499999999981 | 1.358 |
| 0.676999999999981 | 1.359 |
| 0.677499999999981 | 1.36 |
| 0.677999999999981 | 1.36 |
| 0.678499999999981 | 1.361 |
| 0.678999999999981 | 1.362 |
| 0.67949999999998 | 1.363 |
| 0.67999999999998 | 1.364 |
| 0.68049999999998 | 1.365 |
| 0.68099999999998 | 1.366 |
| 0.68149999999998 | 1.366 |
| 0.68199999999998 | 1.367 |
| 0.68249999999998 | 1.368 |
| 0.68299999999998 | 1.369 |
| 0.68349999999998 | 1.37 |
| 0.68399999999998 | 1.371 |
| 0.68449999999998 | 1.372 |
| 0.68499999999998 | 1.373 |
| 0.68549999999998 | 1.373 |
| 0.68599999999998 | 1.374 |
| 0.68649999999998 | 1.375 |
| 0.68699999999998 | 1.376 |
| 0.68749999999998 | 1.377 |
| 0.68799999999998 | 1.378 |
| 0.688499999999979 | 1.379 |
| 0.688999999999979 | 1.38 |
| 0.689499999999979 | 1.381 |
| 0.689999999999979 | 1.382 |
| 0.690499999999979 | 1.382 |
| 0.690999999999979 | 1.383 |
| 0.691499999999979 | 1.384 |
| 0.691999999999979 | 1.385 |
| 0.692499999999979 | 1.386 |
| 0.692999999999979 | 1.387 |
| 0.693499999999979 | 1.388 |
| 0.693999999999979 | 1.389 |
| 0.694499999999979 | 1.39 |
| 0.694999999999979 | 1.391 |
| 0.695499999999979 | 1.392 |
| 0.695999999999979 | 1.393 |
| 0.696499999999979 | 1.394 |
| 0.696999999999979 | 1.395 |
| 0.697499999999978 | 1.396 |
| 0.697999999999978 | 1.396 |
| 0.698499999999978 | 1.397 |
| 0.698999999999978 | 1.398 |
| 0.699499999999978 | 1.399 |
| 0.699999999999978 | 1.4 |
| 0.700499999999978 | 1.401 |
| 0.700999999999978 | 1.402 |
| 0.701499999999978 | 1.403 |
| 0.701999999999978 | 1.404 |
| 0.702499999999978 | 1.405 |
| 0.702999999999978 | 1.406 |
| 0.703499999999978 | 1.407 |
| 0.703999999999978 | 1.408 |
| 0.704499999999978 | 1.409 |
| 0.704999999999978 | 1.41 |
| 0.705499999999978 | 1.411 |
| 0.705999999999978 | 1.412 |
| 0.706499999999978 | 1.413 |
| 0.706999999999977 | 1.414 |
| 0.707499999999977 | 1.415 |
| 0.707999999999977 | 1.416 |
| 0.708499999999977 | 1.417 |
| 0.708999999999977 | 1.418 |
| 0.709499999999977 | 1.419 |
| 0.709999999999977 | 1.42 |
| 0.710499999999977 | 1.421 |
| 0.710999999999977 | 1.422 |
| 0.711499999999977 | 1.423 |
| 0.711999999999977 | 1.424 |
| 0.712499999999977 | 1.425 |
| 0.712999999999977 | 1.426 |
| 0.713499999999977 | 1.427 |
| 0.713999999999977 | 1.428 |
| 0.714499999999977 | 1.429 |
| 0.714999999999977 | 1.43 |
| 0.715499999999977 | 1.431 |
| 0.715999999999976 | 1.432 |
| 0.716499999999976 | 1.434 |
| 0.716999999999976 | 1.435 |
| 0.717499999999976 | 1.436 |
| 0.717999999999976 | 1.437 |
| 0.718499999999976 | 1.438 |
| 0.718999999999976 | 1.439 |
| 0.719499999999976 | 1.44 |
| 0.719999999999976 | 1.441 |
| 0.720499999999976 | 1.442 |
| 0.720999999999976 | 1.443 |
| 0.721499999999976 | 1.444 |
| 0.721999999999976 | 1.445 |
| 0.722499999999976 | 1.446 |
| 0.722999999999976 | 1.447 |
| 0.723499999999976 | 1.449 |
| 0.723999999999976 | 1.45 |
| 0.724499999999976 | 1.451 |
| 0.724999999999975 | 1.452 |
| 0.725499999999975 | 1.453 |
| 0.725999999999975 | 1.454 |
| 0.726499999999975 | 1.455 |
| 0.726999999999975 | 1.456 |
| 0.727499999999975 | 1.457 |
| 0.727999999999975 | 1.459 |
| 0.728499999999975 | 1.46 |
| 0.728999999999975 | 1.461 |
| 0.729499999999975 | 1.462 |
| 0.729999999999975 | 1.463 |
| 0.730499999999975 | 1.464 |
| 0.730999999999975 | 1.465 |
| 0.731499999999975 | 1.467 |
| 0.731999999999975 | 1.468 |
| 0.732499999999975 | 1.469 |
| 0.732999999999975 | 1.47 |
| 0.733499999999975 | 1.471 |
| 0.733999999999974 | 1.472 |
| 0.734499999999974 | 1.474 |
| 0.734999999999974 | 1.475 |
| 0.735499999999974 | 1.476 |
| 0.735999999999974 | 1.477 |
| 0.736499999999974 | 1.478 |
| 0.736999999999974 | 1.48 |
| 0.737499999999974 | 1.481 |
| 0.737999999999974 | 1.482 |
| 0.738499999999974 | 1.483 |
| 0.738999999999974 | 1.484 |
| 0.739499999999974 | 1.486 |
| 0.739999999999974 | 1.487 |
| 0.740499999999974 | 1.488 |
| 0.740999999999974 | 1.489 |
| 0.741499999999974 | 1.49 |
| 0.741999999999974 | 1.492 |
| 0.742499999999974 | 1.493 |
| 0.742999999999973 | 1.494 |
| 0.743499999999973 | 1.495 |
| 0.743999999999973 | 1.497 |
| 0.744499999999973 | 1.498 |
| 0.744999999999973 | 1.499 |
| 0.745499999999973 | 1.5 |
| 0.745999999999973 | 1.502 |
| 0.746499999999973 | 1.503 |
| 0.746999999999973 | 1.504 |
| 0.747499999999973 | 1.505 |
| 0.747999999999973 | 1.507 |
| 0.748499999999973 | 1.508 |
| 0.748999999999973 | 1.509 |
| 0.749499999999973 | 1.511 |
| 0.749999999999973 | 1.512 |
| 0.750499999999973 | 1.513 |
| 0.750999999999973 | 1.514 |
| 0.751499999999973 | 1.516 |
| 0.751999999999973 | 1.517 |
| 0.752499999999972 | 1.518 |
| 0.752999999999972 | 1.52 |
| 0.753499999999972 | 1.521 |
| 0.753999999999972 | 1.522 |
| 0.754499999999972 | 1.524 |
| 0.754999999999972 | 1.525 |
| 0.755499999999972 | 1.526 |
| 0.755999999999972 | 1.528 |
| 0.756499999999972 | 1.529 |
| 0.756999999999972 | 1.53 |
| 0.757499999999972 | 1.532 |
| 0.757999999999972 | 1.533 |
| 0.758499999999972 | 1.535 |
| 0.758999999999972 | 1.536 |
| 0.759499999999972 | 1.537 |
| 0.759999999999972 | 1.539 |
| 0.760499999999972 | 1.54 |
| 0.760999999999972 | 1.541 |
| 0.761499999999971 | 1.543 |
| 0.761999999999971 | 1.544 |
| 0.762499999999971 | 1.546 |
| 0.762999999999971 | 1.547 |
| 0.763499999999971 | 1.548 |
| 0.763999999999971 | 1.55 |
| 0.764499999999971 | 1.551 |
| 0.764999999999971 | 1.553 |
| 0.765499999999971 | 1.554 |
| 0.765999999999971 | 1.556 |
| 0.766499999999971 | 1.557 |
| 0.766999999999971 | 1.558 |
| 0.767499999999971 | 1.56 |
| 0.767999999999971 | 1.561 |
| 0.768499999999971 | 1.563 |
| 0.768999999999971 | 1.564 |
| 0.769499999999971 | 1.566 |
| 0.769999999999971 | 1.567 |
| 0.77049999999997 | 1.569 |
| 0.77099999999997 | 1.57 |
| 0.77149999999997 | 1.572 |
| 0.77199999999997 | 1.573 |
| 0.77249999999997 | 1.575 |
| 0.77299999999997 | 1.576 |
| 0.77349999999997 | 1.578 |
| 0.77399999999997 | 1.579 |
| 0.77449999999997 | 1.581 |
| 0.77499999999997 | 1.582 |
| 0.77549999999997 | 1.584 |
| 0.77599999999997 | 1.585 |
| 0.77649999999997 | 1.587 |
| 0.77699999999997 | 1.589 |
| 0.77749999999997 | 1.59 |
| 0.77799999999997 | 1.592 |
| 0.77849999999997 | 1.593 |
| 0.77899999999997 | 1.595 |
| 0.779499999999969 | 1.596 |
| 0.779999999999969 | 1.598 |
| 0.780499999999969 | 1.6 |
| 0.780999999999969 | 1.601 |
| 0.781499999999969 | 1.603 |
| 0.781999999999969 | 1.604 |
| 0.782499999999969 | 1.606 |
| 0.782999999999969 | 1.608 |
| 0.783499999999969 | 1.609 |
| 0.783999999999969 | 1.611 |
| 0.784499999999969 | 1.613 |
| 0.784999999999969 | 1.614 |
| 0.785499999999969 | 1.616 |
| 0.785999999999969 | 1.618 |
| 0.786499999999969 | 1.619 |
| 0.786999999999969 | 1.621 |
| 0.787499999999969 | 1.623 |
| 0.787999999999969 | 1.624 |
| 0.788499999999968 | 1.626 |
| 0.788999999999968 | 1.628 |
| 0.789499999999968 | 1.629 |
| 0.789999999999968 | 1.631 |
| 0.790499999999968 | 1.633 |
| 0.790999999999968 | 1.634 |
| 0.791499999999968 | 1.636 |
| 0.791999999999968 | 1.638 |
| 0.792499999999968 | 1.64 |
| 0.792999999999968 | 1.641 |
| 0.793499999999968 | 1.643 |
| 0.793999999999968 | 1.645 |
| 0.794499999999968 | 1.647 |
| 0.794999999999968 | 1.649 |
| 0.795499999999968 | 1.65 |
| 0.795999999999968 | 1.652 |
| 0.796499999999968 | 1.654 |
| 0.796999999999968 | 1.656 |
| 0.797499999999967 | 1.657 |
| 0.797999999999967 | 1.659 |
| 0.798499999999967 | 1.661 |
| 0.798999999999967 | 1.663 |
| 0.799499999999967 | 1.665 |
| 0.799999999999967 | 1.667 |
| 0.800499999999967 | 1.669 |
| 0.800999999999967 | 1.67 |
| 0.801499999999967 | 1.672 |
| 0.801999999999967 | 1.674 |
| 0.802499999999967 | 1.676 |
| 0.802999999999967 | 1.678 |
| 0.803499999999967 | 1.68 |
| 0.803999999999967 | 1.682 |
| 0.804499999999967 | 1.684 |
| 0.804999999999967 | 1.686 |
| 0.805499999999967 | 1.687 |
| 0.805999999999967 | 1.689 |
| 0.806499999999967 | 1.691 |
| 0.806999999999966 | 1.693 |
| 0.807499999999966 | 1.695 |
| 0.807999999999966 | 1.697 |
| 0.808499999999966 | 1.699 |
| 0.808999999999966 | 1.701 |
| 0.809499999999966 | 1.703 |
| 0.809999999999966 | 1.705 |
| 0.810499999999966 | 1.707 |
| 0.810999999999966 | 1.709 |
| 0.811499999999966 | 1.711 |
| 0.811999999999966 | 1.713 |
| 0.812499999999966 | 1.715 |
| 0.812999999999966 | 1.717 |
| 0.813499999999966 | 1.719 |
| 0.813999999999966 | 1.722 |
| 0.814499999999966 | 1.724 |
| 0.814999999999966 | 1.726 |
| 0.815499999999966 | 1.728 |
| 0.815999999999965 | 1.73 |
| 0.816499999999965 | 1.732 |
| 0.816999999999965 | 1.734 |
| 0.817499999999965 | 1.736 |
| 0.817999999999965 | 1.738 |
| 0.818499999999965 | 1.741 |
| 0.818999999999965 | 1.743 |
| 0.819499999999965 | 1.745 |
| 0.819999999999965 | 1.747 |
| 0.820499999999965 | 1.749 |
| 0.820999999999965 | 1.752 |
| 0.821499999999965 | 1.754 |
| 0.821999999999965 | 1.756 |
| 0.822499999999965 | 1.758 |
| 0.822999999999965 | 1.76 |
| 0.823499999999965 | 1.763 |
| 0.823999999999965 | 1.765 |
| 0.824499999999965 | 1.767 |
| 0.824999999999964 | 1.769 |
| 0.825499999999964 | 1.772 |
| 0.825999999999964 | 1.774 |
| 0.826499999999964 | 1.776 |
| 0.826999999999964 | 1.779 |
| 0.827499999999964 | 1.781 |
| 0.827999999999964 | 1.783 |
| 0.828499999999964 | 1.786 |
| 0.828999999999964 | 1.788 |
| 0.829499999999964 | 1.79 |
| 0.829999999999964 | 1.793 |
| 0.830499999999964 | 1.795 |
| 0.830999999999964 | 1.798 |
| 0.831499999999964 | 1.8 |
| 0.831999999999964 | 1.803 |
| 0.832499999999964 | 1.805 |
| 0.832999999999964 | 1.807 |
| 0.833499999999964 | 1.81 |
| 0.833999999999963 | 1.812 |
| 0.834499999999963 | 1.815 |
| 0.834999999999963 | 1.817 |
| 0.835499999999963 | 1.82 |
| 0.835999999999963 | 1.822 |
| 0.836499999999963 | 1.825 |
| 0.836999999999963 | 1.827 |
| 0.837499999999963 | 1.83 |
| 0.837999999999963 | 1.833 |
| 0.838499999999963 | 1.835 |
| 0.838999999999963 | 1.838 |
| 0.839499999999963 | 1.84 |
| 0.839999999999963 | 1.843 |
| 0.840499999999963 | 1.846 |
| 0.840999999999963 | 1.848 |
| 0.841499999999963 | 1.851 |
| 0.841999999999963 | 1.854 |
| 0.842499999999963 | 1.856 |
| 0.842999999999963 | 1.859 |
| 0.843499999999962 | 1.862 |
| 0.843999999999962 | 1.864 |
| 0.844499999999962 | 1.867 |
| 0.844999999999962 | 1.87 |
| 0.845499999999962 | 1.873 |
| 0.845999999999962 | 1.876 |
| 0.846499999999962 | 1.878 |
| 0.846999999999962 | 1.881 |
| 0.847499999999962 | 1.884 |
| 0.847999999999962 | 1.887 |
| 0.848499999999962 | 1.89 |
| 0.848999999999962 | 1.893 |
| 0.849499999999962 | 1.895 |
| 0.849999999999962 | 1.898 |
| 0.850499999999962 | 1.901 |
| 0.850999999999962 | 1.904 |
| 0.851499999999962 | 1.907 |
| 0.851999999999962 | 1.91 |
| 0.852499999999961 | 1.913 |
| 0.852999999999961 | 1.916 |
| 0.853499999999961 | 1.919 |
| 0.853999999999961 | 1.922 |
| 0.854499999999961 | 1.925 |
| 0.854999999999961 | 1.928 |
| 0.855499999999961 | 1.931 |
| 0.855999999999961 | 1.934 |
| 0.856499999999961 | 1.937 |
| 0.856999999999961 | 1.941 |
| 0.857499999999961 | 1.944 |
| 0.857999999999961 | 1.947 |
| 0.858499999999961 | 1.95 |
| 0.858999999999961 | 1.953 |
| 0.859499999999961 | 1.956 |
| 0.859999999999961 | 1.96 |
| 0.860499999999961 | 1.963 |
| 0.860999999999961 | 1.966 |
| 0.86149999999996 | 1.969 |
| 0.86199999999996 | 1.973 |
| 0.86249999999996 | 1.976 |
| 0.86299999999996 | 1.979 |
| 0.86349999999996 | 1.983 |
| 0.86399999999996 | 1.986 |
| 0.86449999999996 | 1.99 |
| 0.86499999999996 | 1.993 |
| 0.86549999999996 | 1.996 |
| 0.86599999999996 | 2 |
| 0.86649999999996 | 2.003 |
| 0.86699999999996 | 2.007 |
| 0.86749999999996 | 2.01 |
| 0.86799999999996 | 2.014 |
| 0.86849999999996 | 2.017 |
| 0.86899999999996 | 2.021 |
| 0.86949999999996 | 2.025 |
| 0.86999999999996 | 2.028 |
| 0.870499999999959 | 2.032 |
| 0.870999999999959 | 2.035 |
| 0.871499999999959 | 2.039 |
| 0.871999999999959 | 2.043 |
| 0.872499999999959 | 2.047 |
| 0.872999999999959 | 2.05 |
| 0.873499999999959 | 2.054 |
| 0.873999999999959 | 2.058 |
| 0.874499999999959 | 2.062 |
| 0.874999999999959 | 2.066 |
| 0.875499999999959 | 2.069 |
| 0.875999999999959 | 2.073 |
| 0.876499999999959 | 2.077 |
| 0.876999999999959 | 2.081 |
| 0.877499999999959 | 2.085 |
| 0.877999999999959 | 2.089 |
| 0.878499999999959 | 2.093 |
| 0.878999999999959 | 2.097 |
| 0.879499999999958 | 2.101 |
| 0.879999999999958 | 2.105 |
| 0.880499999999958 | 2.109 |
| 0.880999999999958 | 2.114 |
| 0.881499999999958 | 2.118 |
| 0.881999999999958 | 2.122 |
| 0.882499999999958 | 2.126 |
| 0.882999999999958 | 2.131 |
| 0.883499999999958 | 2.135 |
| 0.883999999999958 | 2.139 |
| 0.884499999999958 | 2.143 |
| 0.884999999999958 | 2.148 |
| 0.885499999999958 | 2.152 |
| 0.885999999999958 | 2.157 |
| 0.886499999999958 | 2.161 |
| 0.886999999999958 | 2.166 |
| 0.887499999999958 | 2.17 |
| 0.887999999999958 | 2.175 |
| 0.888499999999957 | 2.179 |
| 0.888999999999957 | 2.184 |
| 0.889499999999957 | 2.188 |
| 0.889999999999957 | 2.193 |
| 0.890499999999957 | 2.198 |
| 0.890999999999957 | 2.203 |
| 0.891499999999957 | 2.207 |
| 0.891999999999957 | 2.212 |
| 0.892499999999957 | 2.217 |
| 0.892999999999957 | 2.222 |
| 0.893499999999957 | 2.227 |
| 0.893999999999957 | 2.232 |
| 0.894499999999957 | 2.237 |
| 0.894999999999957 | 2.242 |
| 0.895499999999957 | 2.247 |
| 0.895999999999957 | 2.252 |
| 0.896499999999957 | 2.257 |
| 0.896999999999957 | 2.262 |
| 0.897499999999956 | 2.267 |
| 0.897999999999956 | 2.273 |
| 0.898499999999956 | 2.278 |
| 0.898999999999956 | 2.283 |
| 0.899499999999956 | 2.289 |
| 0.899999999999956 | 2.294 |
| 0.900499999999956 | 2.3 |
| 0.900999999999956 | 2.305 |
| 0.901499999999956 | 2.311 |
| 0.901999999999956 | 2.316 |
| 0.902499999999956 | 2.322 |
| 0.902999999999956 | 2.328 |
| 0.903499999999956 | 2.333 |
| 0.903999999999956 | 2.339 |
| 0.904499999999956 | 2.345 |
| 0.904999999999956 | 2.351 |
| 0.905499999999956 | 2.357 |
| 0.905999999999956 | 2.363 |
| 0.906499999999956 | 2.369 |
| 0.906999999999955 | 2.375 |
| 0.907499999999955 | 2.381 |
| 0.907999999999955 | 2.387 |
| 0.908499999999955 | 2.393 |
| 0.908999999999955 | 2.399 |
| 0.909499999999955 | 2.406 |
| 0.909999999999955 | 2.412 |
| 0.910499999999955 | 2.418 |
| 0.910999999999955 | 2.425 |
| 0.911499999999955 | 2.431 |
| 0.911999999999955 | 2.438 |
| 0.912499999999955 | 2.445 |
| 0.912999999999955 | 2.451 |
| 0.913499999999955 | 2.458 |
| 0.913999999999955 | 2.465 |
| 0.914499999999955 | 2.472 |
| 0.914999999999955 | 2.479 |
| 0.915499999999955 | 2.486 |
| 0.915999999999954 | 2.493 |
| 0.916499999999954 | 2.5 |
| 0.916999999999954 | 2.507 |
| 0.917499999999954 | 2.514 |
| 0.917999999999954 | 2.522 |
| 0.918499999999954 | 2.529 |
| 0.918999999999954 | 2.536 |
| 0.919499999999954 | 2.544 |
| 0.919999999999954 | 2.552 |
| 0.920499999999954 | 2.559 |
| 0.920999999999954 | 2.567 |
| 0.921499999999954 | 2.575 |
| 0.921999999999954 | 2.583 |
| 0.922499999999954 | 2.591 |
| 0.922999999999954 | 2.599 |
| 0.923499999999954 | 2.607 |
| 0.923999999999954 | 2.615 |
| 0.924499999999954 | 2.623 |
| 0.924999999999953 | 2.632 |
| 0.925499999999953 | 2.64 |
| 0.925999999999953 | 2.649 |
| 0.926499999999953 | 2.657 |
| 0.926999999999953 | 2.666 |
| 0.927499999999953 | 2.675 |
| 0.927999999999953 | 2.684 |
| 0.928499999999953 | 2.693 |
| 0.928999999999953 | 2.702 |
| 0.929499999999953 | 2.711 |
| 0.929999999999953 | 2.721 |
| 0.930499999999953 | 2.73 |
| 0.930999999999953 | 2.74 |
| 0.931499999999953 | 2.749 |
| 0.931999999999953 | 2.759 |
| 0.932499999999953 | 2.769 |
| 0.932999999999953 | 2.779 |
| 0.933499999999953 | 2.789 |
| 0.933999999999953 | 2.799 |
| 0.934499999999952 | 2.809 |
| 0.934999999999952 | 2.82 |
| 0.935499999999952 | 2.83 |
| 0.935999999999952 | 2.841 |
| 0.936499999999952 | 2.852 |
| 0.936999999999952 | 2.863 |
| 0.937499999999952 | 2.874 |
| 0.937999999999952 | 2.885 |
| 0.938499999999952 | 2.896 |
| 0.938999999999952 | 2.908 |
| 0.939499999999952 | 2.919 |
| 0.939999999999952 | 2.931 |
| 0.940499999999952 | 2.943 |
| 0.940999999999952 | 2.955 |
| 0.941499999999952 | 2.967 |
| 0.941999999999952 | 2.98 |
| 0.942499999999952 | 2.992 |
| 0.942999999999952 | 3.005 |
| 0.943499999999951 | 3.018 |
| 0.943999999999951 | 3.031 |
| 0.944499999999951 | 3.044 |
| 0.944999999999951 | 3.057 |
| 0.945499999999951 | 3.071 |
| 0.945999999999951 | 3.085 |
| 0.946499999999951 | 3.099 |
| 0.946999999999951 | 3.113 |
| 0.947499999999951 | 3.127 |
| 0.947999999999951 | 3.142 |
| 0.948499999999951 | 3.157 |
| 0.948999999999951 | 3.172 |
| 0.949499999999951 | 3.187 |
| 0.949999999999951 | 3.203 |
| 0.950499999999951 | 3.218 |
| 0.950999999999951 | 3.234 |
| 0.951499999999951 | 3.25 |
| 0.951999999999951 | 3.267 |
| 0.95249999999995 | 3.284 |
| 0.95299999999995 | 3.301 |
| 0.95349999999995 | 3.318 |
| 0.95399999999995 | 3.335 |
| 0.95449999999995 | 3.353 |
| 0.95499999999995 | 3.371 |
| 0.95549999999995 | 3.39 |
| 0.95599999999995 | 3.409 |
| 0.95649999999995 | 3.428 |
| 0.95699999999995 | 3.447 |
| 0.95749999999995 | 3.467 |
| 0.95799999999995 | 3.487 |
| 0.95849999999995 | 3.508 |
| 0.95899999999995 | 3.529 |
| 0.95949999999995 | 3.55 |
| 0.95999999999995 | 3.571 |
| 0.96049999999995 | 3.594 |
| 0.96099999999995 | 3.616 |
| 0.961499999999949 | 3.639 |
| 0.961999999999949 | 3.662 |
| 0.962499999999949 | 3.686 |
| 0.962999999999949 | 3.711 |
| 0.963499999999949 | 3.735 |
| 0.963999999999949 | 3.761 |
| 0.964499999999949 | 3.787 |
| 0.964999999999949 | 3.813 |
| 0.965499999999949 | 3.84 |
| 0.965999999999949 | 3.868 |
| 0.966499999999949 | 3.896 |
| 0.966999999999949 | 3.925 |
| 0.967499999999949 | 3.955 |
| 0.967999999999949 | 3.985 |
| 0.968499999999949 | 4.016 |
| 0.968999999999949 | 4.048 |
| 0.969499999999949 | 4.08 |
| 0.969999999999949 | 4.113 |
| 0.970499999999948 | 4.148 |
| 0.970999999999948 | 4.183 |
| 0.971499999999948 | 4.219 |
| 0.971999999999948 | 4.256 |
| 0.972499999999948 | 4.294 |
| 0.972999999999948 | 4.333 |
| 0.973499999999948 | 4.373 |
| 0.973999999999948 | 4.414 |
| 0.974499999999948 | 4.457 |
| 0.974999999999948 | 4.5 |
| 0.975499999999948 | 4.545 |
| 0.975999999999948 | 4.592 |
| 0.976499999999948 | 4.64 |
| 0.976999999999948 | 4.69 |
| 0.977499999999948 | 4.741 |
| 0.977999999999948 | 4.794 |
| 0.978499999999948 | 4.849 |
| 0.978999999999948 | 4.905 |
| 0.979499999999947 | 4.964 |
| 0.979999999999947 | 5.025 |
| 0.980499999999947 | 5.089 |
| 0.980999999999947 | 5.154 |
| 0.981499999999947 | 5.223 |
| 0.981999999999947 | 5.294 |
| 0.982499999999947 | 5.369 |
| 0.982999999999947 | 5.446 |
| 0.983499999999947 | 5.528 |
| 0.983999999999947 | 5.613 |
| 0.984499999999947 | 5.702 |
| 0.984999999999947 | 5.795 |
| 0.985499999999947 | 5.894 |
| 0.985999999999947 | 5.997 |
| 0.986499999999947 | 6.106 |
| 0.986999999999947 | 6.222 |
| 0.987499999999947 | 6.344 |
| 0.987999999999947 | 6.474 |
| 0.988499999999946 | 6.613 |
| 0.988999999999946 | 6.761 |
| 0.989499999999946 | 6.919 |
| 0.989999999999946 | 7.089 |
| 0.990499999999946 | 7.272 |
| 0.990999999999946 | 7.47 |
| 0.991499999999946 | 7.686 |
| 0.991999999999946 | 7.922 |
| 0.992499999999946 | 8.18 |
| 0.992999999999946 | 8.466 |
| 0.993499999999946 | 8.785 |
| 0.993999999999946 | 9.142 |
| 0.994499999999946 | 9.548 |
| 0.994999999999946 | 10.013 |
| 0.995499999999946 | 10.553 |
| 0.995999999999946 | 11.192 |
| 0.996499999999946 | 11.963 |
| 0.996999999999946 | 12.92 |
| 0.997499999999945 | 14.151 |
| 0.997999999999945 | 15.819 |
| 0.998499999999945 | 18.264 |
| 0.998999999999945 | 22.366 |
| 0.999499999999945 | 31.627 |
| 0.999999999999945 | 3022431.227 |